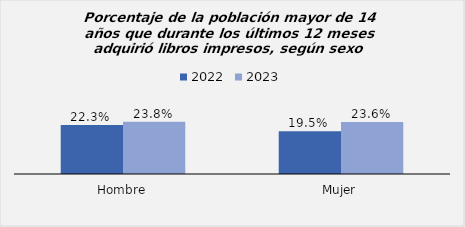
| Category | 2022 | 2023 |
|---|---|---|
| Hombre | 0.223 | 0.238 |
| Mujer | 0.195 | 0.236 |